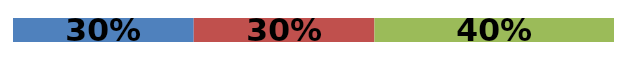
| Category | Series 0 | Series 1 | Series 2 |
|---|---|---|---|
| 0 | 0.301 | 0.301 | 0.399 |